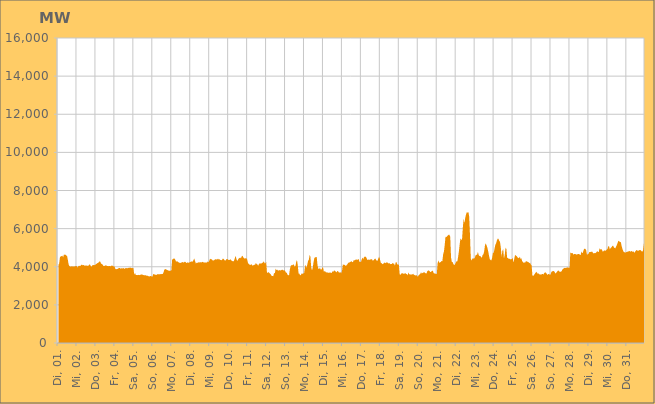
| Category | Series 0 |
|---|---|
|  Di, 01.  | 4093.412 |
|  Di, 01.  | 4180.983 |
|  Di, 01.  | 4518.888 |
|  Di, 01.  | 4537.282 |
|  Di, 01.  | 4558.302 |
|  Di, 01.  | 4575.785 |
|  Di, 01.  | 4495.659 |
|  Di, 01.  | 4639.948 |
|  Di, 01.  | 4631.361 |
|  Di, 01.  | 4628.879 |
|  Di, 01.  | 4590.587 |
|  Di, 01.  | 4557.312 |
|  Di, 01.  | 4352.51 |
|  Di, 01.  | 4115.664 |
|  Di, 01.  | 4037.194 |
|  Di, 01.  | 4008.94 |
|  Di, 01.  | 4005.574 |
|  Mi, 02.  | 4025.931 |
|  Mi, 02.  | 4014.993 |
|  Mi, 02.  | 4012.813 |
|  Mi, 02.  | 4012.868 |
|  Mi, 02.  | 4024.992 |
|  Mi, 02.  | 4039.979 |
|  Mi, 02.  | 4040.878 |
|  Mi, 02.  | 3956.999 |
|  Mi, 02.  | 4014.334 |
|  Mi, 02.  | 4052.442 |
|  Mi, 02.  | 4044.431 |
|  Mi, 02.  | 4049.215 |
|  Mi, 02.  | 4098.622 |
|  Mi, 02.  | 4101.95 |
|  Mi, 02.  | 4074.276 |
|  Mi, 02.  | 4095.639 |
|  Mi, 02.  | 4059.464 |
|  Mi, 02.  | 4052.61 |
|  Mi, 02.  | 4084.743 |
|  Mi, 02.  | 4047.395 |
|  Mi, 02.  | 4052.417 |
|  Mi, 02.  | 4046.525 |
|  Mi, 02.  | 4113.649 |
|  Mi, 02.  | 4124.591 |
|  Do, 03.  | 4027.789 |
|  Do, 03.  | 4002.805 |
|  Do, 03.  | 4074.11 |
|  Do, 03.  | 4096.477 |
|  Do, 03.  | 4081.123 |
|  Do, 03.  | 4094.87 |
|  Do, 03.  | 4109.321 |
|  Do, 03.  | 4146.613 |
|  Do, 03.  | 4179.992 |
|  Do, 03.  | 4200.726 |
|  Do, 03.  | 4230.647 |
|  Do, 03.  | 4278.492 |
|  Do, 03.  | 4268.491 |
|  Do, 03.  | 4165.237 |
|  Do, 03.  | 4145.932 |
|  Do, 03.  | 4113.808 |
|  Do, 03.  | 4043.752 |
|  Do, 03.  | 4039.631 |
|  Do, 03.  | 4053.726 |
|  Do, 03.  | 4083.148 |
|  Do, 03.  | 4050.649 |
|  Do, 03.  | 4041.017 |
|  Do, 03.  | 4028.536 |
|  Do, 03.  | 4037.289 |
|  Fr, 04.  | 4038.137 |
|  Fr, 04.  | 4025.327 |
|  Fr, 04.  | 4064.227 |
|  Fr, 04.  | 4047.778 |
|  Fr, 04.  | 4048.186 |
|  Fr, 04.  | 4015.669 |
|  Fr, 04.  | 4014.39 |
|  Fr, 04.  | 3901.78 |
|  Fr, 04.  | 3865.298 |
|  Fr, 04.  | 3883.491 |
|  Fr, 04.  | 3889.291 |
|  Fr, 04.  | 3925.797 |
|  Fr, 04.  | 3928.995 |
|  Fr, 04.  | 3928.209 |
|  Fr, 04.  | 3898.038 |
|  Fr, 04.  | 3921.928 |
|  Fr, 04.  | 3905.526 |
|  Fr, 04.  | 3938.136 |
|  Fr, 04.  | 3909.878 |
|  Fr, 04.  | 3890.933 |
|  Fr, 04.  | 3930.881 |
|  Fr, 04.  | 3928.445 |
|  Fr, 04.  | 3916.024 |
|  Fr, 04.  | 3929.873 |
|  Sa, 05.  | 3945.403 |
|  Sa, 05.  | 3945.152 |
|  Sa, 05.  | 3955.682 |
|  Sa, 05.  | 3946.27 |
|  Sa, 05.  | 3924.621 |
|  Sa, 05.  | 3931.037 |
|  Sa, 05.  | 3927.276 |
|  Sa, 05.  | 3583.305 |
|  Sa, 05.  | 3674.742 |
|  Sa, 05.  | 3571.79 |
|  Sa, 05.  | 3568.399 |
|  Sa, 05.  | 3559.417 |
|  Sa, 05.  | 3577.746 |
|  Sa, 05.  | 3558.942 |
|  Sa, 05.  | 3563.587 |
|  Sa, 05.  | 3583.674 |
|  Sa, 05.  | 3592.814 |
|  Sa, 05.  | 3598.595 |
|  Sa, 05.  | 3567.046 |
|  Sa, 05.  | 3559.64 |
|  Sa, 05.  | 3549.425 |
|  Sa, 05.  | 3547.659 |
|  Sa, 05.  | 3547.709 |
|  Sa, 05.  | 3522.49 |
|  So, 06.  | 3528.423 |
|  So, 06.  | 3505.343 |
|  So, 06.  | 3491.814 |
|  So, 06.  | 3499.876 |
|  So, 06.  | 3519.107 |
|  So, 06.  | 3487.035 |
|  So, 06.  | 3481.073 |
|  So, 06.  | 3608.671 |
|  So, 06.  | 3626.563 |
|  So, 06.  | 3576.116 |
|  So, 06.  | 3574.903 |
|  So, 06.  | 3572.334 |
|  So, 06.  | 3602.021 |
|  So, 06.  | 3610.696 |
|  So, 06.  | 3611.612 |
|  So, 06.  | 3608.165 |
|  So, 06.  | 3611.565 |
|  So, 06.  | 3616.851 |
|  So, 06.  | 3611.142 |
|  So, 06.  | 3620.118 |
|  So, 06.  | 3693.51 |
|  So, 06.  | 3834.572 |
|  So, 06.  | 3877.429 |
|  So, 06.  | 3868.731 |
|  Mo, 07.  | 3845.638 |
|  Mo, 07.  | 3822.916 |
|  Mo, 07.  | 3806.7 |
|  Mo, 07.  | 3791.705 |
|  Mo, 07.  | 3792.528 |
|  Mo, 07.  | 3789.071 |
|  Mo, 07.  | 3817.096 |
|  Mo, 07.  | 4372.237 |
|  Mo, 07.  | 4410.3 |
|  Mo, 07.  | 4425.284 |
|  Mo, 07.  | 4432.796 |
|  Mo, 07.  | 4362.333 |
|  Mo, 07.  | 4260.301 |
|  Mo, 07.  | 4293.692 |
|  Mo, 07.  | 4271.817 |
|  Mo, 07.  | 4234.136 |
|  Mo, 07.  | 4213.435 |
|  Mo, 07.  | 4196.1 |
|  Mo, 07.  | 4210.268 |
|  Mo, 07.  | 4224.14 |
|  Mo, 07.  | 4250.13 |
|  Mo, 07.  | 4224.496 |
|  Mo, 07.  | 4231.448 |
|  Mo, 07.  | 4268.764 |
|  Di, 08.  | 4250.474 |
|  Di, 08.  | 4190.339 |
|  Di, 08.  | 4226.829 |
|  Di, 08.  | 4218.686 |
|  Di, 08.  | 4211.88 |
|  Di, 08.  | 4229.506 |
|  Di, 08.  | 4253.425 |
|  Di, 08.  | 4262.552 |
|  Di, 08.  | 4283.404 |
|  Di, 08.  | 4261.87 |
|  Di, 08.  | 4351.575 |
|  Di, 08.  | 4436.351 |
|  Di, 08.  | 4290.517 |
|  Di, 08.  | 4175.521 |
|  Di, 08.  | 4206.745 |
|  Di, 08.  | 4207.528 |
|  Di, 08.  | 4214.06 |
|  Di, 08.  | 4253.682 |
|  Di, 08.  | 4212.525 |
|  Di, 08.  | 4245.768 |
|  Di, 08.  | 4224.499 |
|  Di, 08.  | 4252.46 |
|  Di, 08.  | 4256.218 |
|  Di, 08.  | 4222.33 |
|  Mi, 09.  | 4216.941 |
|  Mi, 09.  | 4218.791 |
|  Mi, 09.  | 4228.93 |
|  Mi, 09.  | 4219.395 |
|  Mi, 09.  | 4279.506 |
|  Mi, 09.  | 4233.074 |
|  Mi, 09.  | 4313.039 |
|  Mi, 09.  | 4425.617 |
|  Mi, 09.  | 4390.8 |
|  Mi, 09.  | 4393.747 |
|  Mi, 09.  | 4338.539 |
|  Mi, 09.  | 4322.075 |
|  Mi, 09.  | 4339.659 |
|  Mi, 09.  | 4375.58 |
|  Mi, 09.  | 4396.048 |
|  Mi, 09.  | 4385.053 |
|  Mi, 09.  | 4383.373 |
|  Mi, 09.  | 4423.395 |
|  Mi, 09.  | 4376.968 |
|  Mi, 09.  | 4393.436 |
|  Mi, 09.  | 4356.031 |
|  Mi, 09.  | 4345.611 |
|  Mi, 09.  | 4349.096 |
|  Mi, 09.  | 4425.023 |
|  Do, 10.  | 4415.857 |
|  Do, 10.  | 4362.472 |
|  Do, 10.  | 4319.771 |
|  Do, 10.  | 4348.735 |
|  Do, 10.  | 4414.687 |
|  Do, 10.  | 4398.423 |
|  Do, 10.  | 4361.327 |
|  Do, 10.  | 4356.597 |
|  Do, 10.  | 4365.816 |
|  Do, 10.  | 4396.165 |
|  Do, 10.  | 4326.183 |
|  Do, 10.  | 4298.732 |
|  Do, 10.  | 4283.219 |
|  Do, 10.  | 4296.688 |
|  Do, 10.  | 4390.894 |
|  Do, 10.  | 4568.643 |
|  Do, 10.  | 4462.303 |
|  Do, 10.  | 4329.554 |
|  Do, 10.  | 4329.311 |
|  Do, 10.  | 4422.833 |
|  Do, 10.  | 4453.288 |
|  Do, 10.  | 4483.344 |
|  Do, 10.  | 4442.097 |
|  Do, 10.  | 4542.808 |
|  Fr, 11.  | 4580.671 |
|  Fr, 11.  | 4496.738 |
|  Fr, 11.  | 4441.163 |
|  Fr, 11.  | 4427.727 |
|  Fr, 11.  | 4448.679 |
|  Fr, 11.  | 4448.883 |
|  Fr, 11.  | 4368.208 |
|  Fr, 11.  | 4192.093 |
|  Fr, 11.  | 4142.495 |
|  Fr, 11.  | 4105.755 |
|  Fr, 11.  | 4093.815 |
|  Fr, 11.  | 4133.459 |
|  Fr, 11.  | 4106.553 |
|  Fr, 11.  | 4043.796 |
|  Fr, 11.  | 4092.32 |
|  Fr, 11.  | 4104.761 |
|  Fr, 11.  | 4108.082 |
|  Fr, 11.  | 4198.997 |
|  Fr, 11.  | 4139.786 |
|  Fr, 11.  | 4114.439 |
|  Fr, 11.  | 4054.242 |
|  Fr, 11.  | 4156.295 |
|  Fr, 11.  | 4175.614 |
|  Fr, 11.  | 4172.557 |
|  Sa, 12.  | 4173.825 |
|  Sa, 12.  | 4200.012 |
|  Sa, 12.  | 4226.787 |
|  Sa, 12.  | 4287.427 |
|  Sa, 12.  | 4186.214 |
|  Sa, 12.  | 4184.685 |
|  Sa, 12.  | 4251.235 |
|  Sa, 12.  | 3688.016 |
|  Sa, 12.  | 3691.858 |
|  Sa, 12.  | 3719.457 |
|  Sa, 12.  | 3679.393 |
|  Sa, 12.  | 3631.429 |
|  Sa, 12.  | 3585.246 |
|  Sa, 12.  | 3514.988 |
|  Sa, 12.  | 3511.219 |
|  Sa, 12.  | 3506.617 |
|  Sa, 12.  | 3675.691 |
|  Sa, 12.  | 3655.671 |
|  Sa, 12.  | 3899.211 |
|  Sa, 12.  | 3824.066 |
|  Sa, 12.  | 3846.427 |
|  Sa, 12.  | 3799.842 |
|  Sa, 12.  | 3804.535 |
|  Sa, 12.  | 3828.41 |
|  So, 13.  | 3803.938 |
|  So, 13.  | 3819.817 |
|  So, 13.  | 3842.279 |
|  So, 13.  | 3834.969 |
|  So, 13.  | 3802.911 |
|  So, 13.  | 3824.693 |
|  So, 13.  | 3777.789 |
|  So, 13.  | 3695.145 |
|  So, 13.  | 3686.638 |
|  So, 13.  | 3591.963 |
|  So, 13.  | 3547.192 |
|  So, 13.  | 3567.197 |
|  So, 13.  | 3870.564 |
|  So, 13.  | 4030.808 |
|  So, 13.  | 4090.39 |
|  So, 13.  | 4069.759 |
|  So, 13.  | 4114.96 |
|  So, 13.  | 4114.804 |
|  So, 13.  | 4002.985 |
|  So, 13.  | 4039.057 |
|  So, 13.  | 4248.57 |
|  So, 13.  | 4358.477 |
|  So, 13.  | 4075.785 |
|  So, 13.  | 3648.427 |
|  Mo, 14.  | 3639.49 |
|  Mo, 14.  | 3545.936 |
|  Mo, 14.  | 3572.004 |
|  Mo, 14.  | 3658.562 |
|  Mo, 14.  | 3624.4 |
|  Mo, 14.  | 3647.278 |
|  Mo, 14.  | 3664.794 |
|  Mo, 14.  | 3959.586 |
|  Mo, 14.  | 4103.561 |
|  Mo, 14.  | 3939.117 |
|  Mo, 14.  | 4103.722 |
|  Mo, 14.  | 4312.57 |
|  Mo, 14.  | 4362.374 |
|  Mo, 14.  | 4618.644 |
|  Mo, 14.  | 4524.328 |
|  Mo, 14.  | 3970.084 |
|  Mo, 14.  | 3800.053 |
|  Mo, 14.  | 3968.815 |
|  Mo, 14.  | 4251.988 |
|  Mo, 14.  | 4463.881 |
|  Mo, 14.  | 4490.593 |
|  Mo, 14.  | 4506.152 |
|  Mo, 14.  | 4509.611 |
|  Mo, 14.  | 4070.484 |
|  Di, 15.  | 3900.31 |
|  Di, 15.  | 3878.743 |
|  Di, 15.  | 3948.768 |
|  Di, 15.  | 3860.954 |
|  Di, 15.  | 3848.415 |
|  Di, 15.  | 3952.203 |
|  Di, 15.  | 3969.288 |
|  Di, 15.  | 3746.997 |
|  Di, 15.  | 3765.158 |
|  Di, 15.  | 3746.614 |
|  Di, 15.  | 3692.412 |
|  Di, 15.  | 3716.958 |
|  Di, 15.  | 3688.021 |
|  Di, 15.  | 3688.569 |
|  Di, 15.  | 3684.78 |
|  Di, 15.  | 3708.215 |
|  Di, 15.  | 3673.538 |
|  Di, 15.  | 3683.011 |
|  Di, 15.  | 3768.582 |
|  Di, 15.  | 3736.51 |
|  Di, 15.  | 3804.897 |
|  Di, 15.  | 3787.641 |
|  Di, 15.  | 3749.661 |
|  Di, 15.  | 3699.979 |
|  Mi, 16.  | 3778.744 |
|  Mi, 16.  | 3763.039 |
|  Mi, 16.  | 3702.068 |
|  Mi, 16.  | 3699.69 |
|  Mi, 16.  | 3708.871 |
|  Mi, 16.  | 3655.736 |
|  Mi, 16.  | 3785.367 |
|  Mi, 16.  | 4116.776 |
|  Mi, 16.  | 4103.596 |
|  Mi, 16.  | 4103.498 |
|  Mi, 16.  | 4081.028 |
|  Mi, 16.  | 4040.779 |
|  Mi, 16.  | 4098.97 |
|  Mi, 16.  | 4145.004 |
|  Mi, 16.  | 4210.875 |
|  Mi, 16.  | 4220.381 |
|  Mi, 16.  | 4235.511 |
|  Mi, 16.  | 4267.31 |
|  Mi, 16.  | 4294.956 |
|  Mi, 16.  | 4229.465 |
|  Mi, 16.  | 4262.02 |
|  Mi, 16.  | 4356.948 |
|  Mi, 16.  | 4329.216 |
|  Mi, 16.  | 4364.608 |
|  Do, 17.  | 4386.572 |
|  Do, 17.  | 4364.063 |
|  Do, 17.  | 4370.891 |
|  Do, 17.  | 4413.564 |
|  Do, 17.  | 4256.398 |
|  Do, 17.  | 4259.607 |
|  Do, 17.  | 4249.815 |
|  Do, 17.  | 4394.177 |
|  Do, 17.  | 4478.428 |
|  Do, 17.  | 4393.563 |
|  Do, 17.  | 4539.106 |
|  Do, 17.  | 4498.353 |
|  Do, 17.  | 4548.294 |
|  Do, 17.  | 4455.367 |
|  Do, 17.  | 4368.431 |
|  Do, 17.  | 4347.674 |
|  Do, 17.  | 4394.538 |
|  Do, 17.  | 4352.748 |
|  Do, 17.  | 4387.239 |
|  Do, 17.  | 4402.206 |
|  Do, 17.  | 4384.028 |
|  Do, 17.  | 4316.74 |
|  Do, 17.  | 4343.215 |
|  Do, 17.  | 4392.562 |
|  Fr, 18.  | 4442.445 |
|  Fr, 18.  | 4367.856 |
|  Fr, 18.  | 4315.112 |
|  Fr, 18.  | 4312.693 |
|  Fr, 18.  | 4442.543 |
|  Fr, 18.  | 4526.169 |
|  Fr, 18.  | 4405.149 |
|  Fr, 18.  | 4207.666 |
|  Fr, 18.  | 4195.496 |
|  Fr, 18.  | 4134.543 |
|  Fr, 18.  | 4169.318 |
|  Fr, 18.  | 4172.858 |
|  Fr, 18.  | 4230.446 |
|  Fr, 18.  | 4183.659 |
|  Fr, 18.  | 4218.779 |
|  Fr, 18.  | 4241.065 |
|  Fr, 18.  | 4195.098 |
|  Fr, 18.  | 4170.334 |
|  Fr, 18.  | 4200.902 |
|  Fr, 18.  | 4134.353 |
|  Fr, 18.  | 4147.107 |
|  Fr, 18.  | 4143.384 |
|  Fr, 18.  | 4201.772 |
|  Fr, 18.  | 4168.439 |
|  Sa, 19.  | 4152.507 |
|  Sa, 19.  | 4055.827 |
|  Sa, 19.  | 4239.846 |
|  Sa, 19.  | 4244.497 |
|  Sa, 19.  | 4112.375 |
|  Sa, 19.  | 4124.117 |
|  Sa, 19.  | 4086.182 |
|  Sa, 19.  | 3606.852 |
|  Sa, 19.  | 3573.827 |
|  Sa, 19.  | 3637.861 |
|  Sa, 19.  | 3672.43 |
|  Sa, 19.  | 3644.032 |
|  Sa, 19.  | 3633.829 |
|  Sa, 19.  | 3637.739 |
|  Sa, 19.  | 3674.689 |
|  Sa, 19.  | 3622.775 |
|  Sa, 19.  | 3619.675 |
|  Sa, 19.  | 3547.881 |
|  Sa, 19.  | 3698.455 |
|  Sa, 19.  | 3610.033 |
|  Sa, 19.  | 3594.496 |
|  Sa, 19.  | 3599.535 |
|  Sa, 19.  | 3587.035 |
|  Sa, 19.  | 3599.399 |
|  So, 20.  | 3630.905 |
|  So, 20.  | 3581.909 |
|  So, 20.  | 3566.699 |
|  So, 20.  | 3534.618 |
|  So, 20.  | 3568.504 |
|  So, 20.  | 3514.774 |
|  So, 20.  | 3468.752 |
|  So, 20.  | 3563.026 |
|  So, 20.  | 3589.669 |
|  So, 20.  | 3622.989 |
|  So, 20.  | 3710.153 |
|  So, 20.  | 3643.929 |
|  So, 20.  | 3676.084 |
|  So, 20.  | 3696.306 |
|  So, 20.  | 3718.716 |
|  So, 20.  | 3684.348 |
|  So, 20.  | 3650.111 |
|  So, 20.  | 3653.144 |
|  So, 20.  | 3769.538 |
|  So, 20.  | 3801.531 |
|  So, 20.  | 3804.958 |
|  So, 20.  | 3758.979 |
|  So, 20.  | 3714.25 |
|  So, 20.  | 3745.554 |
|  Mo, 21.  | 3784.519 |
|  Mo, 21.  | 3783.374 |
|  Mo, 21.  | 3668.438 |
|  Mo, 21.  | 3648.112 |
|  Mo, 21.  | 3639.988 |
|  Mo, 21.  | 3624.201 |
|  Mo, 21.  | 3626.404 |
|  Mo, 21.  | 4179.322 |
|  Mo, 21.  | 4335.605 |
|  Mo, 21.  | 4211.269 |
|  Mo, 21.  | 4229.912 |
|  Mo, 21.  | 4248.604 |
|  Mo, 21.  | 4297.274 |
|  Mo, 21.  | 4293.111 |
|  Mo, 21.  | 4651.291 |
|  Mo, 21.  | 4799.842 |
|  Mo, 21.  | 5147.528 |
|  Mo, 21.  | 5573.951 |
|  Mo, 21.  | 5557.384 |
|  Mo, 21.  | 5599.154 |
|  Mo, 21.  | 5648.257 |
|  Mo, 21.  | 5675.303 |
|  Mo, 21.  | 5672.868 |
|  Mo, 21.  | 5562.846 |
|  Di, 22.  | 4484.59 |
|  Di, 22.  | 4253.366 |
|  Di, 22.  | 4242.798 |
|  Di, 22.  | 4140.366 |
|  Di, 22.  | 4084.93 |
|  Di, 22.  | 4124.727 |
|  Di, 22.  | 4220.609 |
|  Di, 22.  | 4285.374 |
|  Di, 22.  | 4282.25 |
|  Di, 22.  | 4537.412 |
|  Di, 22.  | 4822.156 |
|  Di, 22.  | 5211.489 |
|  Di, 22.  | 5498.12 |
|  Di, 22.  | 5396.152 |
|  Di, 22.  | 5469.979 |
|  Di, 22.  | 6101.213 |
|  Di, 22.  | 6522.024 |
|  Di, 22.  | 6289.39 |
|  Di, 22.  | 6578.562 |
|  Di, 22.  | 6746.415 |
|  Di, 22.  | 6857.226 |
|  Di, 22.  | 6843.328 |
|  Di, 22.  | 6864.84 |
|  Di, 22.  | 6616.504 |
|  Mi, 23.  | 5643.143 |
|  Mi, 23.  | 4424.979 |
|  Mi, 23.  | 4320.608 |
|  Mi, 23.  | 4434.617 |
|  Mi, 23.  | 4433.324 |
|  Mi, 23.  | 4434.025 |
|  Mi, 23.  | 4455.881 |
|  Mi, 23.  | 4594.595 |
|  Mi, 23.  | 4631.55 |
|  Mi, 23.  | 4636.588 |
|  Mi, 23.  | 4773.724 |
|  Mi, 23.  | 4615.192 |
|  Mi, 23.  | 4561.118 |
|  Mi, 23.  | 4569.537 |
|  Mi, 23.  | 4506.102 |
|  Mi, 23.  | 4476.886 |
|  Mi, 23.  | 4618.143 |
|  Mi, 23.  | 4656.421 |
|  Mi, 23.  | 4826.957 |
|  Mi, 23.  | 5141.278 |
|  Mi, 23.  | 5229.884 |
|  Mi, 23.  | 5116.063 |
|  Mi, 23.  | 4992.302 |
|  Mi, 23.  | 4815.365 |
|  Do, 24.  | 4597.485 |
|  Do, 24.  | 4399.111 |
|  Do, 24.  | 4353.455 |
|  Do, 24.  | 4332.664 |
|  Do, 24.  | 4466.524 |
|  Do, 24.  | 4722.554 |
|  Do, 24.  | 4739.671 |
|  Do, 24.  | 4932.959 |
|  Do, 24.  | 5147.189 |
|  Do, 24.  | 5229.454 |
|  Do, 24.  | 5370.516 |
|  Do, 24.  | 5475.431 |
|  Do, 24.  | 5461.91 |
|  Do, 24.  | 5366.902 |
|  Do, 24.  | 5301.514 |
|  Do, 24.  | 5002.89 |
|  Do, 24.  | 4530.131 |
|  Do, 24.  | 4834.206 |
|  Do, 24.  | 4928.246 |
|  Do, 24.  | 4428.224 |
|  Do, 24.  | 4632.077 |
|  Do, 24.  | 4997.978 |
|  Do, 24.  | 4944.386 |
|  Do, 24.  | 4483.662 |
|  Fr, 25.  | 4451.298 |
|  Fr, 25.  | 4416.374 |
|  Fr, 25.  | 4423.724 |
|  Fr, 25.  | 4390.741 |
|  Fr, 25.  | 4385.543 |
|  Fr, 25.  | 4410.314 |
|  Fr, 25.  | 4466.796 |
|  Fr, 25.  | 4218.016 |
|  Fr, 25.  | 4406.993 |
|  Fr, 25.  | 4612.286 |
|  Fr, 25.  | 4595.555 |
|  Fr, 25.  | 4558.959 |
|  Fr, 25.  | 4497.437 |
|  Fr, 25.  | 4471.603 |
|  Fr, 25.  | 4443.758 |
|  Fr, 25.  | 4534.81 |
|  Fr, 25.  | 4409.735 |
|  Fr, 25.  | 4449.139 |
|  Fr, 25.  | 4304.235 |
|  Fr, 25.  | 4245.408 |
|  Fr, 25.  | 4206.272 |
|  Fr, 25.  | 4226.298 |
|  Fr, 25.  | 4228.237 |
|  Fr, 25.  | 4303.134 |
|  Sa, 26.  | 4269.801 |
|  Sa, 26.  | 4260.595 |
|  Sa, 26.  | 4244.456 |
|  Sa, 26.  | 4181.689 |
|  Sa, 26.  | 4220.454 |
|  Sa, 26.  | 4114.371 |
|  Sa, 26.  | 4068.729 |
|  Sa, 26.  | 3538.603 |
|  Sa, 26.  | 3513.119 |
|  Sa, 26.  | 3571.611 |
|  Sa, 26.  | 3628.943 |
|  Sa, 26.  | 3688.225 |
|  Sa, 26.  | 3736.525 |
|  Sa, 26.  | 3676.969 |
|  Sa, 26.  | 3629.909 |
|  Sa, 26.  | 3652.726 |
|  Sa, 26.  | 3590.258 |
|  Sa, 26.  | 3589.256 |
|  Sa, 26.  | 3592.675 |
|  Sa, 26.  | 3608.94 |
|  Sa, 26.  | 3623.527 |
|  Sa, 26.  | 3591.412 |
|  Sa, 26.  | 3667.619 |
|  Sa, 26.  | 3703.928 |
|  So, 27.  | 3700.611 |
|  So, 27.  | 3630.329 |
|  So, 27.  | 3575.301 |
|  So, 27.  | 3610.623 |
|  So, 27.  | 3628.568 |
|  So, 27.  | 3571.922 |
|  So, 27.  | 3596.141 |
|  So, 27.  | 3725.825 |
|  So, 27.  | 3767.364 |
|  So, 27.  | 3757.8 |
|  So, 27.  | 3784.997 |
|  So, 27.  | 3733.098 |
|  So, 27.  | 3637.914 |
|  So, 27.  | 3684.587 |
|  So, 27.  | 3719.267 |
|  So, 27.  | 3788.681 |
|  So, 27.  | 3803.735 |
|  So, 27.  | 3755.048 |
|  So, 27.  | 3723.647 |
|  So, 27.  | 3746.483 |
|  So, 27.  | 3764.566 |
|  So, 27.  | 3867.179 |
|  So, 27.  | 3880.492 |
|  So, 27.  | 3944.036 |
|  Mo, 28.  | 3932.216 |
|  Mo, 28.  | 3940.129 |
|  Mo, 28.  | 3945.493 |
|  Mo, 28.  | 3968.807 |
|  Mo, 28.  | 3955.663 |
|  Mo, 28.  | 3947.349 |
|  Mo, 28.  | 3946.355 |
|  Mo, 28.  | 4752.704 |
|  Mo, 28.  | 4706.014 |
|  Mo, 28.  | 4727.229 |
|  Mo, 28.  | 4711.768 |
|  Mo, 28.  | 4626.549 |
|  Mo, 28.  | 4675.348 |
|  Mo, 28.  | 4673.655 |
|  Mo, 28.  | 4649.902 |
|  Mo, 28.  | 4643.803 |
|  Mo, 28.  | 4656.338 |
|  Mo, 28.  | 4665.279 |
|  Mo, 28.  | 4672.45 |
|  Mo, 28.  | 4625.057 |
|  Mo, 28.  | 4612.848 |
|  Mo, 28.  | 4806.886 |
|  Mo, 28.  | 4709.688 |
|  Mo, 28.  | 4755.175 |
|  Di, 29.  | 4904.104 |
|  Di, 29.  | 4951.691 |
|  Di, 29.  | 4933.431 |
|  Di, 29.  | 4874.017 |
|  Di, 29.  | 4641.282 |
|  Di, 29.  | 4644.198 |
|  Di, 29.  | 4681.127 |
|  Di, 29.  | 4773.628 |
|  Di, 29.  | 4780.942 |
|  Di, 29.  | 4771.462 |
|  Di, 29.  | 4797.615 |
|  Di, 29.  | 4778.187 |
|  Di, 29.  | 4702.845 |
|  Di, 29.  | 4703.374 |
|  Di, 29.  | 4723.373 |
|  Di, 29.  | 4714.072 |
|  Di, 29.  | 4761.682 |
|  Di, 29.  | 4821.578 |
|  Di, 29.  | 4778.148 |
|  Di, 29.  | 4773.961 |
|  Di, 29.  | 4971.084 |
|  Di, 29.  | 4903.509 |
|  Di, 29.  | 4929.077 |
|  Di, 29.  | 4882.896 |
|  Mi, 30.  | 4792.209 |
|  Mi, 30.  | 4816.106 |
|  Mi, 30.  | 4861.398 |
|  Mi, 30.  | 4836.641 |
|  Mi, 30.  | 4854.285 |
|  Mi, 30.  | 4891.405 |
|  Mi, 30.  | 4934.953 |
|  Mi, 30.  | 5079.942 |
|  Mi, 30.  | 5078.865 |
|  Mi, 30.  | 4909.971 |
|  Mi, 30.  | 4987.15 |
|  Mi, 30.  | 5015.364 |
|  Mi, 30.  | 5077.994 |
|  Mi, 30.  | 5112.399 |
|  Mi, 30.  | 5027.596 |
|  Mi, 30.  | 4985.679 |
|  Mi, 30.  | 4972.418 |
|  Mi, 30.  | 5063.84 |
|  Mi, 30.  | 5160.926 |
|  Mi, 30.  | 5274.061 |
|  Mi, 30.  | 5366.592 |
|  Mi, 30.  | 5328.121 |
|  Mi, 30.  | 5300.327 |
|  Mi, 30.  | 5281.946 |
|  Do, 31.  | 5068.059 |
|  Do, 31.  | 4928.566 |
|  Do, 31.  | 4816.352 |
|  Do, 31.  | 4754.87 |
|  Do, 31.  | 4755.45 |
|  Do, 31.  | 4745.169 |
|  Do, 31.  | 4770.685 |
|  Do, 31.  | 4767.536 |
|  Do, 31.  | 4818.978 |
|  Do, 31.  | 4797.515 |
|  Do, 31.  | 4831.432 |
|  Do, 31.  | 4787.367 |
|  Do, 31.  | 4828.492 |
|  Do, 31.  | 4810.022 |
|  Do, 31.  | 4789.213 |
|  Do, 31.  | 4809.595 |
|  Do, 31.  | 4730.12 |
|  Do, 31.  | 4788.547 |
|  Do, 31.  | 4845.613 |
|  Do, 31.  | 4887.814 |
|  Do, 31.  | 4839.431 |
|  Do, 31.  | 4840.007 |
|  Do, 31.  | 4864.246 |
|  Do, 31.  | 4881.859 |
|  Fr, 01.  | 4867.417 |
|  Fr, 01.  | 4819.656 |
|  Fr, 01.  | 4790.275 |
|  Fr, 01.  | 4848.299 |
|  Fr, 01.  | 5184.396 |
|  Fr, 01.  | 5451.149 |